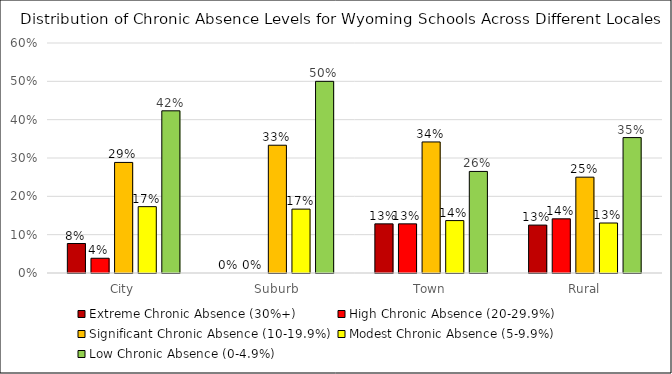
| Category | Extreme Chronic Absence (30%+) | High Chronic Absence (20-29.9%) | Significant Chronic Absence (10-19.9%) | Modest Chronic Absence (5-9.9%) | Low Chronic Absence (0-4.9%) |
|---|---|---|---|---|---|
| City | 0.077 | 0.038 | 0.288 | 0.173 | 0.423 |
| Suburb | 0 | 0 | 0.333 | 0.167 | 0.5 |
| Town | 0.128 | 0.128 | 0.342 | 0.137 | 0.265 |
| Rural | 0.125 | 0.141 | 0.25 | 0.13 | 0.353 |